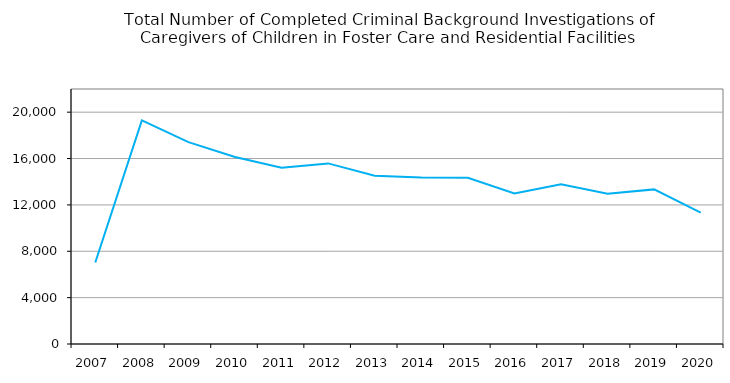
| Category | Series 0 |
|---|---|
| 2007.0 | 7027 |
| 2008.0 | 19290 |
| 2009.0 | 17414 |
| 2010.0 | 16132 |
| 2011.0 | 15215 |
| 2012.0 | 15582 |
| 2013.0 | 14508 |
| 2014.0 | 14375 |
| 2015.0 | 14339 |
| 2016.0 | 12979 |
| 2017.0 | 13781 |
| 2018.0 | 12967 |
| 2019.0 | 13339 |
| 2020.0 | 11340 |